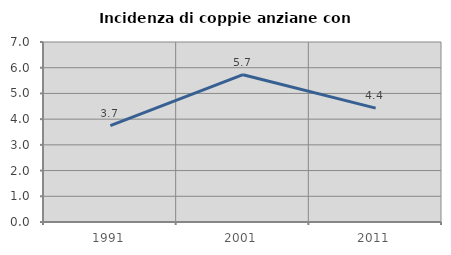
| Category | Incidenza di coppie anziane con figli |
|---|---|
| 1991.0 | 3.744 |
| 2001.0 | 5.729 |
| 2011.0 | 4.428 |